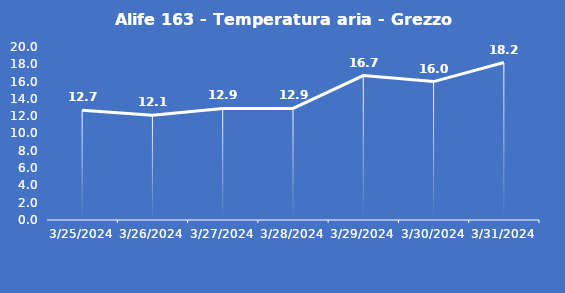
| Category | Alife 163 - Temperatura aria - Grezzo (°C) |
|---|---|
| 3/25/24 | 12.7 |
| 3/26/24 | 12.1 |
| 3/27/24 | 12.9 |
| 3/28/24 | 12.9 |
| 3/29/24 | 16.7 |
| 3/30/24 | 16 |
| 3/31/24 | 18.2 |